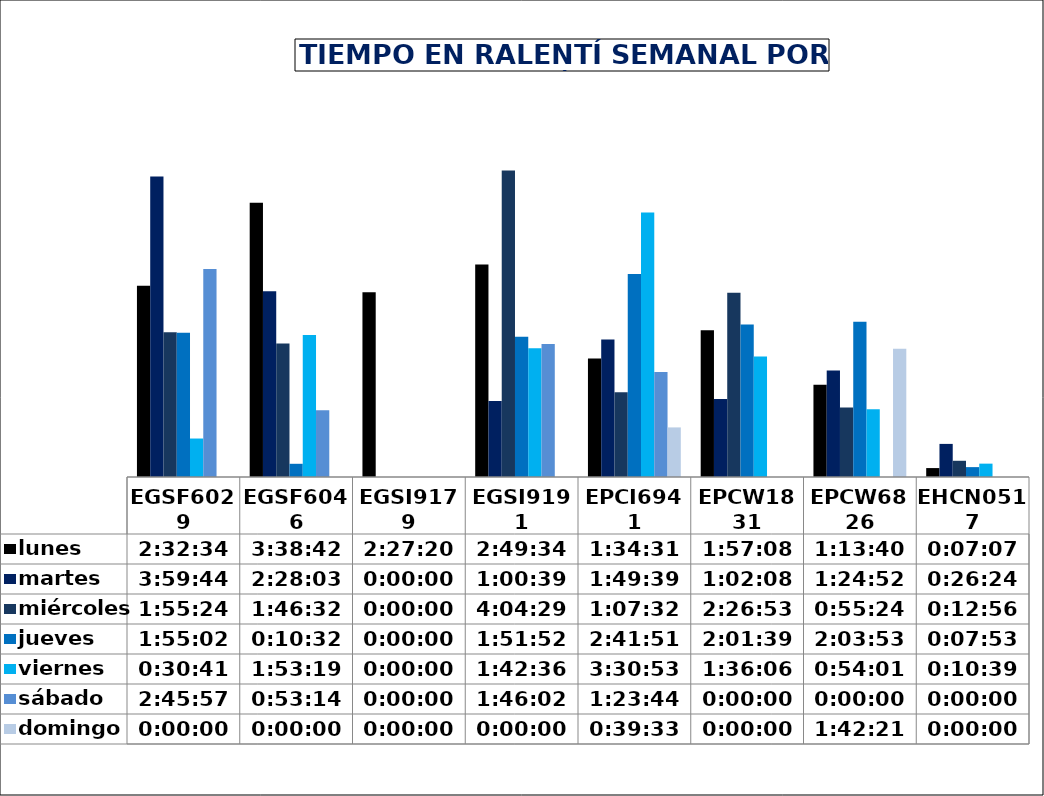
| Category | lunes | martes | miércoles | jueves | viernes | sábado | domingo |
|---|---|---|---|---|---|---|---|
| EGSF6029 | 0.106 | 0.166 | 0.08 | 0.08 | 0.021 | 0.115 | 0 |
| EGSF6046 | 0.152 | 0.103 | 0.074 | 0.007 | 0.079 | 0.037 | 0 |
| EGSI9179 | 0.102 | 0 | 0 | 0 | 0 | 0 | 0 |
| EGSI9191 | 0.118 | 0.042 | 0.17 | 0.078 | 0.071 | 0.074 | 0 |
| EPCI6941 | 0.066 | 0.076 | 0.047 | 0.112 | 0.146 | 0.058 | 0.027 |
| EPCW1831 | 0.081 | 0.043 | 0.102 | 0.084 | 0.067 | 0 | 0 |
| EPCW6826 | 0.051 | 0.059 | 0.038 | 0.086 | 0.038 | 0 | 0.071 |
| EHCN0517 | 0.005 | 0.018 | 0.009 | 0.005 | 0.007 | 0 | 0 |